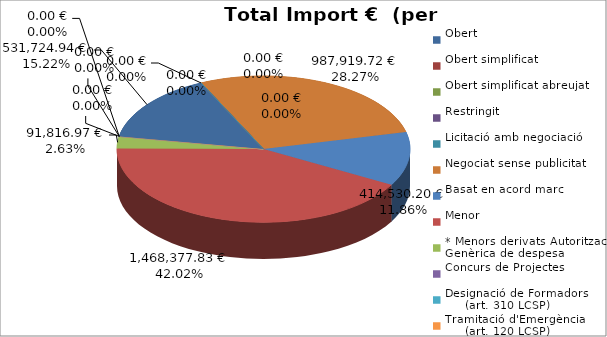
| Category | Total preu
(amb IVA) |
|---|---|
| Obert | 531724.94 |
| Obert simplificat | 0 |
| Obert simplificat abreujat | 0 |
| Restringit | 0 |
| Licitació amb negociació | 0 |
| Negociat sense publicitat | 987919.72 |
| Basat en acord marc | 414530.2 |
| Menor | 1468377.83 |
| * Menors derivats Autorització Genèrica de despesa | 91816.97 |
| Concurs de Projectes | 0 |
| Designació de Formadors
     (art. 310 LCSP) | 0 |
| Tramitació d'Emergència
     (art. 120 LCSP) | 0 |